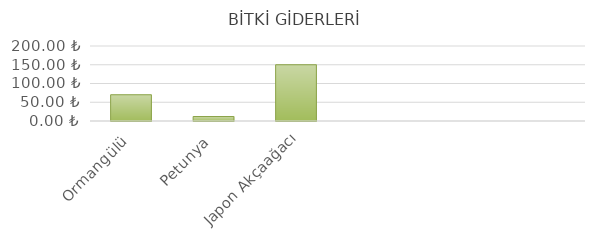
| Category | Ormangülü |
|---|---|
| Ormangülü | 70 |
| Petunya | 11.94 |
| Japon Akçaağacı | 150 |